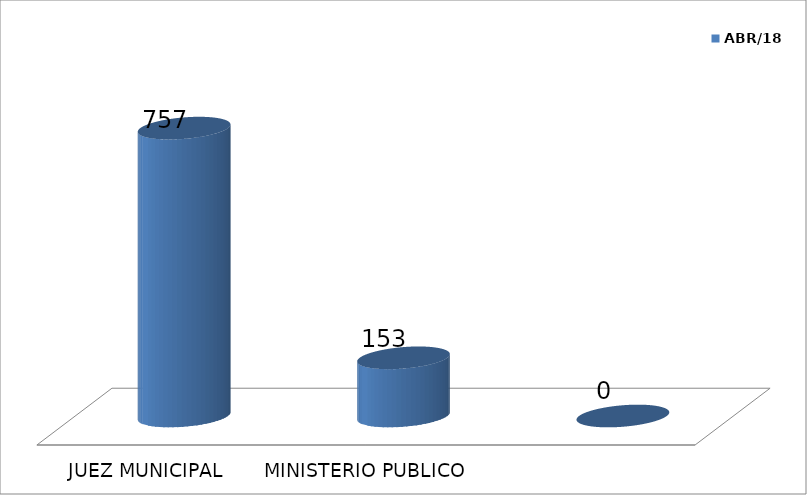
| Category | ABR/18 |
|---|---|
| JUEZ MUNICIPAL | 757 |
| MINISTERIO PUBLICO | 153 |